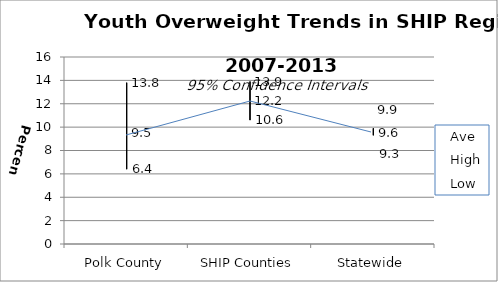
| Category | Ave | High | Low |
|---|---|---|---|
| Polk County | 9.5 | 13.8 | 6.4 |
| SHIP Counties | 12.2 | 13.9 | 10.6 |
| Statewide | 9.6 | 9.9 | 9.3 |